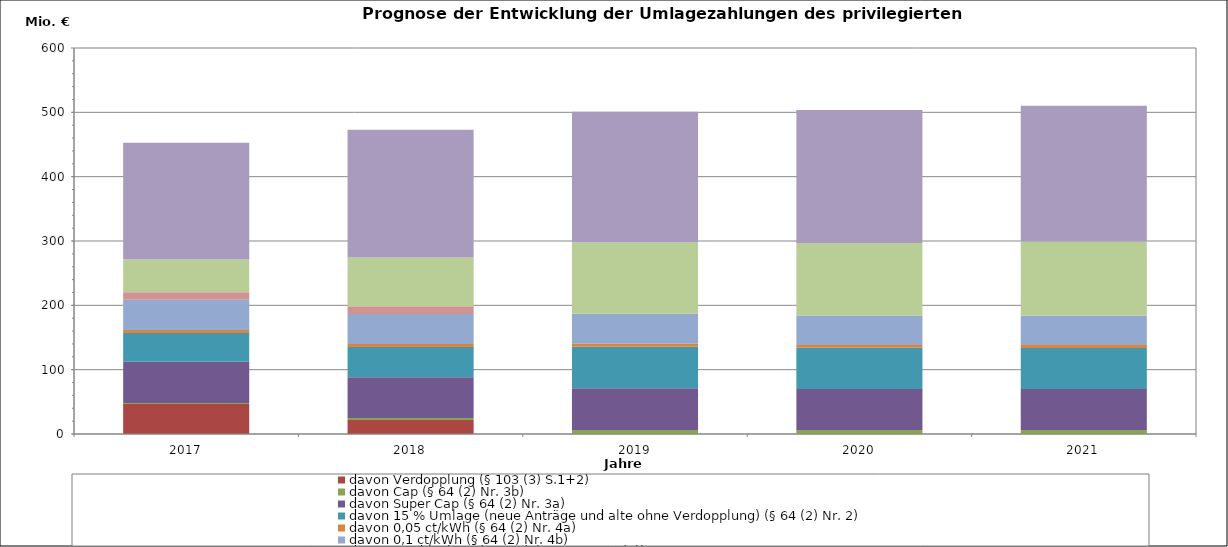
| Category | davon Verdopplung (§ 103 (3) S.1+2) | davon Cap (§ 64 (2) Nr. 3b) | davon Super Cap (§ 64 (2) Nr. 3a) | davon 15 % Umlage (neue Anträge und alte ohne Verdopplung) (§ 64 (2) Nr. 2) | davon 0,05 ct/kWh (§ 64 (2) Nr. 4a) | davon 0,1 ct/kWh (§ 64 (2) Nr. 4b) | davon Verdopplung (§ 103 (4) i.V.m. §103 (3)) | davon 20 % | Schienenbahnen (§ 65 (2)) |
|---|---|---|---|---|---|---|---|---|---|
| 2017.0 | 46.686 | 1.312 | 64.288 | 44.661 | 4.669 | 47.093 | 11.655 | 50.724 | 181.805 |
| 2018.0 | 21.74 | 3.321 | 63.091 | 46.958 | 4.618 | 46.624 | 12.049 | 75.973 | 198.687 |
| 2019.0 | 0 | 6.395 | 64.659 | 64.757 | 4.571 | 46.409 | 0 | 111.354 | 202.66 |
| 2020.0 | 0 | 6.31 | 63.797 | 63.9 | 4.511 | 45.799 | 0 | 112.734 | 206.713 |
| 2021.0 | 0 | 6.298 | 63.676 | 63.783 | 4.501 | 45.713 | 0 | 115.264 | 210.848 |